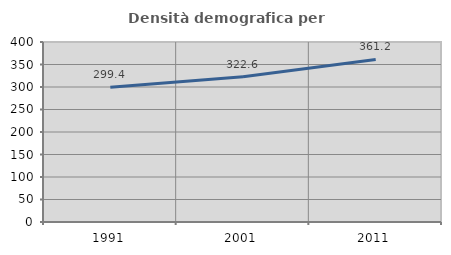
| Category | Densità demografica |
|---|---|
| 1991.0 | 299.353 |
| 2001.0 | 322.557 |
| 2011.0 | 361.16 |